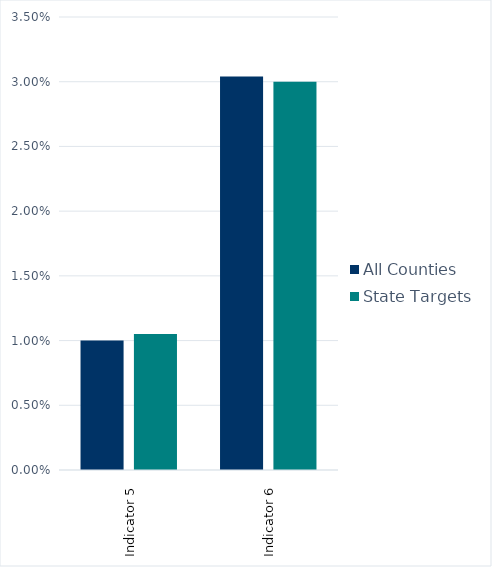
| Category | All Counties | State Targets |
|---|---|---|
| Indicator 5 | 0.01 | 0.01 |
| Indicator 6 | 0.03 | 0.03 |